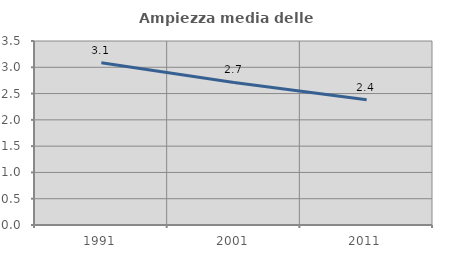
| Category | Ampiezza media delle famiglie |
|---|---|
| 1991.0 | 3.085 |
| 2001.0 | 2.712 |
| 2011.0 | 2.383 |